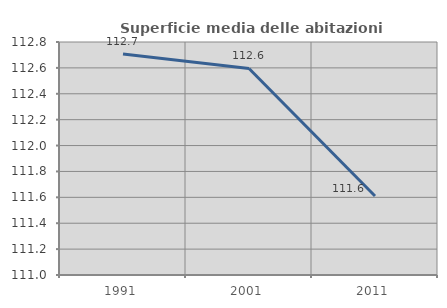
| Category | Superficie media delle abitazioni occupate |
|---|---|
| 1991.0 | 112.706 |
| 2001.0 | 112.595 |
| 2011.0 | 111.61 |